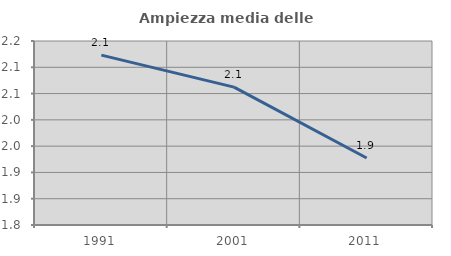
| Category | Ampiezza media delle famiglie |
|---|---|
| 1991.0 | 2.123 |
| 2001.0 | 2.062 |
| 2011.0 | 1.928 |